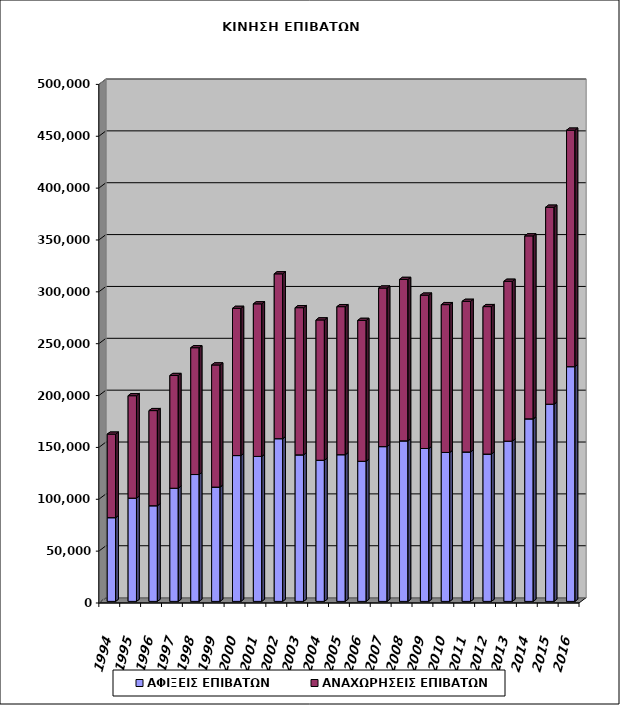
| Category | ΑΦΙΞΕΙΣ ΕΠΙΒΑΤΩΝ | ΑΝΑΧΩΡΗΣΕΙΣ ΕΠΙΒΑΤΩΝ |
|---|---|---|
| 1994.0 | 80734 | 80495 |
| 1995.0 | 99550 | 98750 |
| 1996.0 | 92225 | 91708 |
| 1997.0 | 109088 | 108686 |
| 1998.0 | 122303 | 122258 |
| 1999.0 | 110199 | 117733 |
| 2000.0 | 140592 | 141890 |
| 2001.0 | 139773 | 147084 |
| 2002.0 | 156879 | 158912 |
| 2003.0 | 141254 | 141908 |
| 2004.0 | 136061 | 135301 |
| 2005.0 | 141440 | 142712 |
| 2006.0 | 135083 | 135818 |
| 2007.0 | 149231 | 152857 |
| 2008.0 | 154765 | 155639 |
| 2009.0 | 147402 | 147831 |
| 2010.0 | 143597 | 142508 |
| 2011.0 | 144058 | 145207 |
| 2012.0 | 142027 | 142179 |
| 2013.0 | 154489 | 154118 |
| 2014.0 | 175986 | 176398 |
| 2015.0 | 190129 | 189882 |
| 2016.0 | 226308 | 227992 |